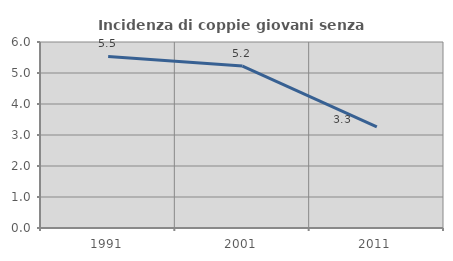
| Category | Incidenza di coppie giovani senza figli |
|---|---|
| 1991.0 | 5.533 |
| 2001.0 | 5.222 |
| 2011.0 | 3.265 |